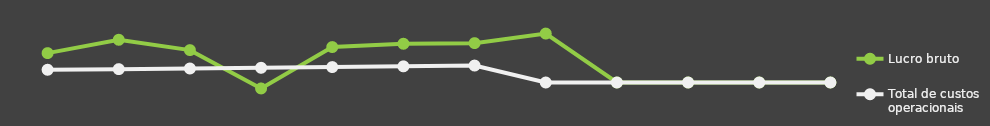
| Category | Lucro bruto | Total de custos operacionais |
|---|---|---|
| 0 | 25000 | 10841 |
| 1 | 36348 | 11367.25 |
| 2 | 27562 | 11919.82 |
| 3 | -5059.5 | 12500.01 |
| 4 | 30153.18 | 13109.21 |
| 5 | 32964.45 | 13748.86 |
| 6 | 33502.87 | 14420.51 |
| 7 | 41646 | 0 |
| 8 | 0 | 0 |
| 9 | 0 | 0 |
| 10 | 0 | 0 |
| 11 | 0 | 0 |